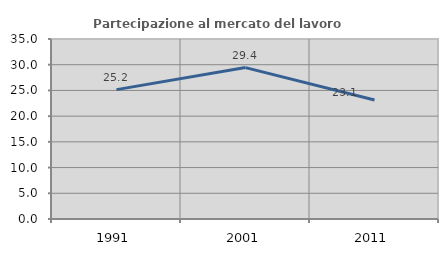
| Category | Partecipazione al mercato del lavoro  femminile |
|---|---|
| 1991.0 | 25.16 |
| 2001.0 | 29.44 |
| 2011.0 | 23.143 |